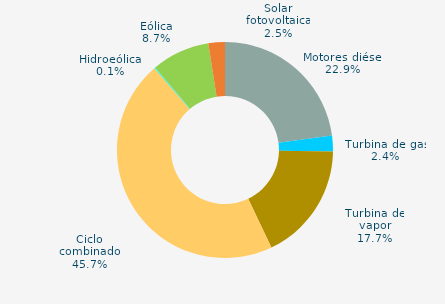
| Category | Series 0 |
|---|---|
| Motores diésel | 22.871 |
| Turbina de gas | 2.36 |
| Turbina de vapor | 17.699 |
| Ciclo combinado | 45.742 |
| Cogeneración | 0 |
| Hidráulica | 0 |
| Hidroeólica | 0.137 |
| Eólica | 8.71 |
| Solar fotovoltaica | 2.481 |
| Otras renovables | 0 |